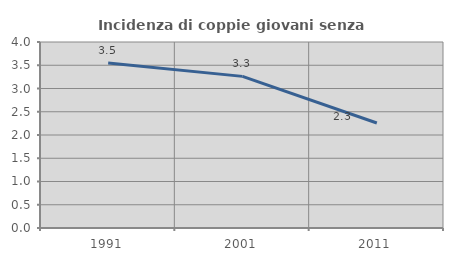
| Category | Incidenza di coppie giovani senza figli |
|---|---|
| 1991.0 | 3.55 |
| 2001.0 | 3.261 |
| 2011.0 | 2.258 |